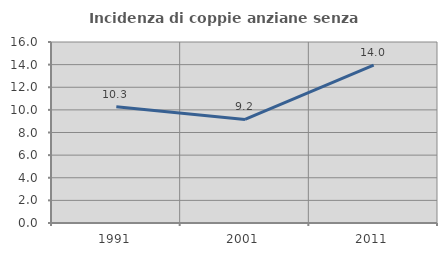
| Category | Incidenza di coppie anziane senza figli  |
|---|---|
| 1991.0 | 10.276 |
| 2001.0 | 9.158 |
| 2011.0 | 13.953 |